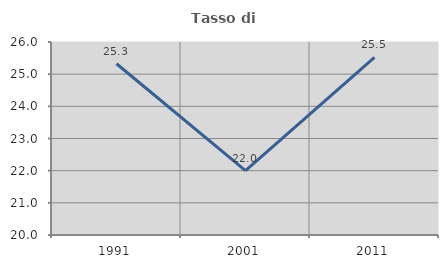
| Category | Tasso di occupazione   |
|---|---|
| 1991.0 | 25.325 |
| 2001.0 | 22 |
| 2011.0 | 25.524 |